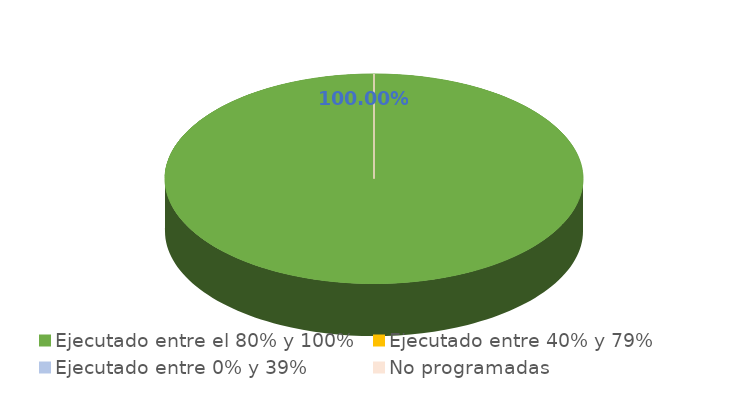
| Category | Series 0 |
|---|---|
| Ejecutado entre el 80% y 100% | 1 |
| Ejecutado entre 40% y 79% | 0 |
| Ejecutado entre 0% y 39% | 0 |
| No programadas | 0 |